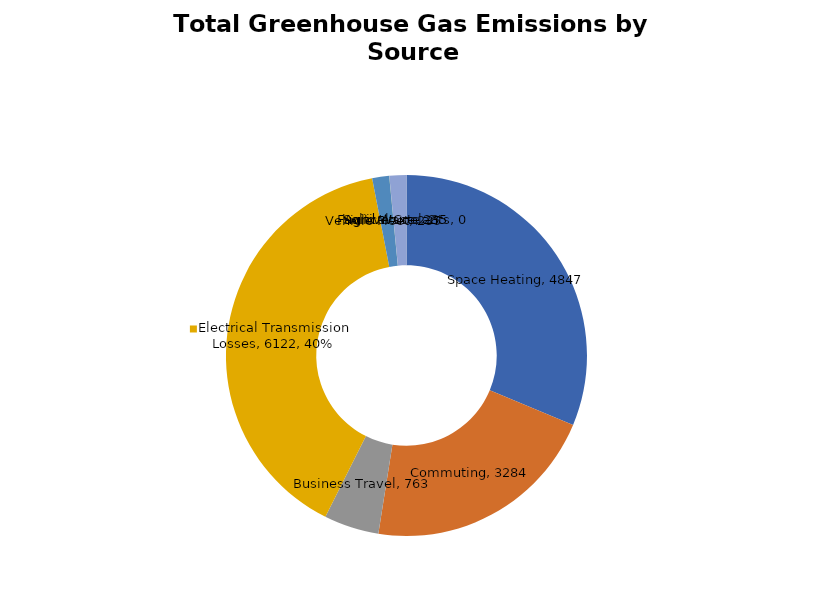
| Category | MTCDE |
|---|---|
| Space Heating | 4846.734 |
| Commuting | 3283.579 |
| Business Travel | 762.538 |
| Electrical Transmission Losses | 6122.272 |
| Vehicle Fleet | 235.129 |
| Solid Waste | 2.117 |
| Agriculture | 235.062 |
| Fugitive Coolants | 0.32 |